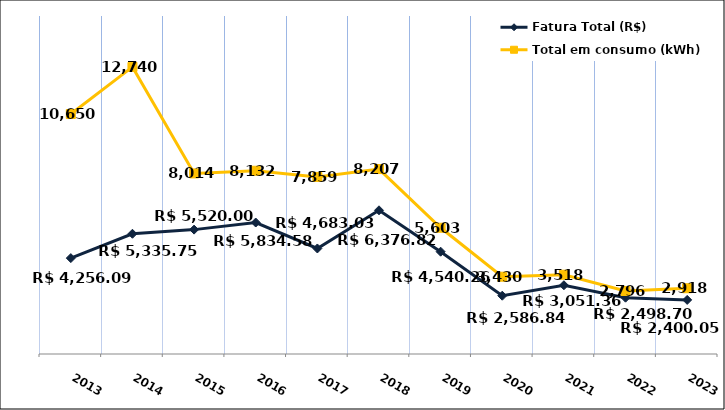
| Category | Fatura Total (R$) |
|---|---|
| 2013.0 | 4256.09 |
| 2014.0 | 5335.75 |
| 2015.0 | 5520 |
| 2016.0 | 5834.58 |
| 2017.0 | 4683.03 |
| 2018.0 | 6376.82 |
| 2019.0 | 4540.26 |
| 2020.0 | 2586.84 |
| 2021.0 | 3051.36 |
| 2022.0 | 2498.7 |
| 2023.0 | 2400.05 |